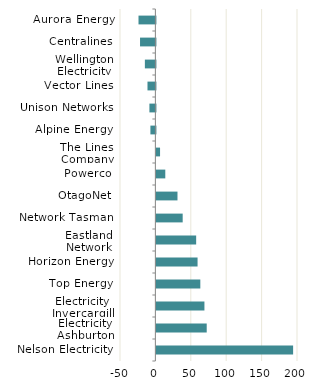
| Category | Series 0 |
|---|---|
| Aurora Energy | -23.862 |
| Centralines | -21.703 |
| Wellington Electricity | -14.874 |
| Vector Lines | -11.182 |
| Unison Networks | -8.468 |
| Alpine Energy | -7.055 |
| The Lines Company | 5.165 |
| Powerco | 12.56 |
| OtagoNet | 29.783 |
| Network Tasman | 37.122 |
| Eastland Network | 56.161 |
| Horizon Energy | 58.142 |
| Top Energy | 62.035 |
| Electricity Invercargill | 67.839 |
| Electricity Ashburton | 71.069 |
| Nelson Electricity | 193.101 |